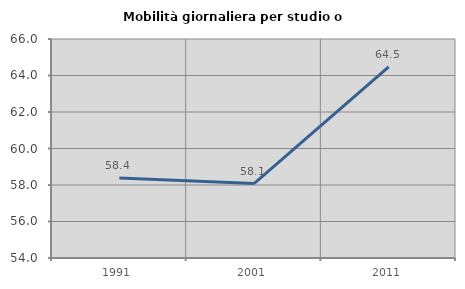
| Category | Mobilità giornaliera per studio o lavoro |
|---|---|
| 1991.0 | 58.378 |
| 2001.0 | 58.081 |
| 2011.0 | 64.467 |